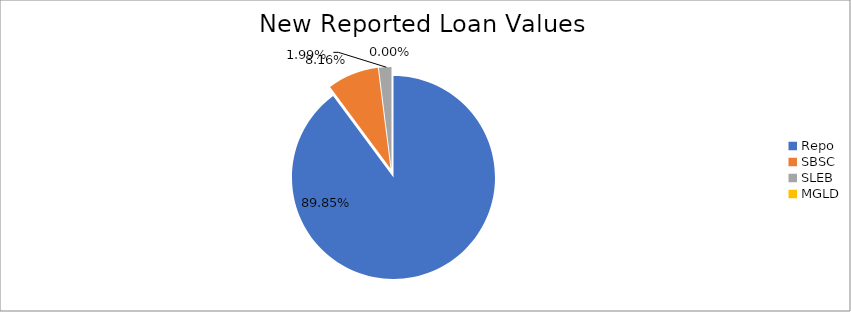
| Category | Series 0 |
|---|---|
| Repo | 10644571.605 |
| SBSC | 966265.203 |
| SLEB | 235337.615 |
| MGLD | 243.794 |